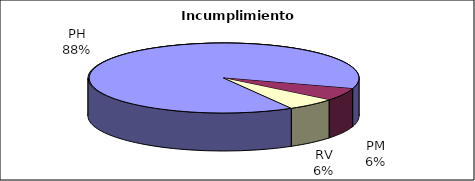
| Category | Efectivo |
|---|---|
| PH | 15 |
| PM | 1 |
| RV | 1 |